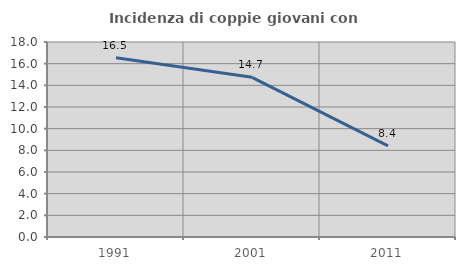
| Category | Incidenza di coppie giovani con figli |
|---|---|
| 1991.0 | 16.544 |
| 2001.0 | 14.741 |
| 2011.0 | 8.407 |